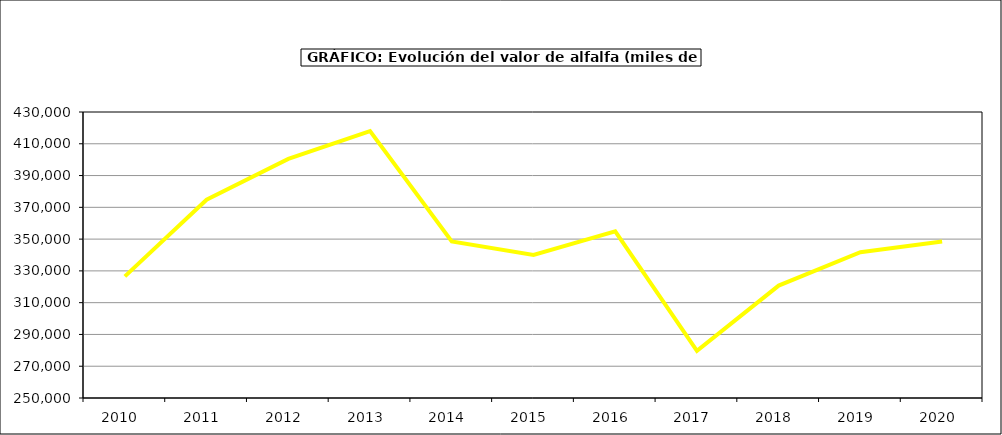
| Category | Valor |
|---|---|
| 2010.0 | 326568.228 |
| 2011.0 | 374822.873 |
| 2012.0 | 400520.754 |
| 2013.0 | 417975.354 |
| 2014.0 | 348510.593 |
| 2015.0 | 340064 |
| 2016.0 | 354947 |
| 2017.0 | 279674.885 |
| 2018.0 | 320740.744 |
| 2019.0 | 341773.556 |
| 2020.0 | 348475.357 |